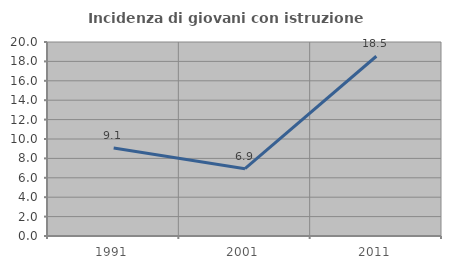
| Category | Incidenza di giovani con istruzione universitaria |
|---|---|
| 1991.0 | 9.067 |
| 2001.0 | 6.936 |
| 2011.0 | 18.531 |